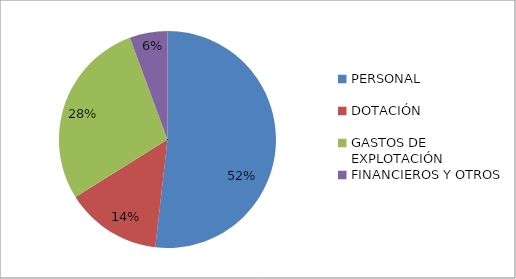
| Category | 2017 |
|---|---|
| PERSONAL | 2148490.38 |
| DOTACIÓN | 594038.73 |
| GASTOS DE EXPLOTACIÓN | 1171745.38 |
| FINANCIEROS Y OTROS | 233861.34 |